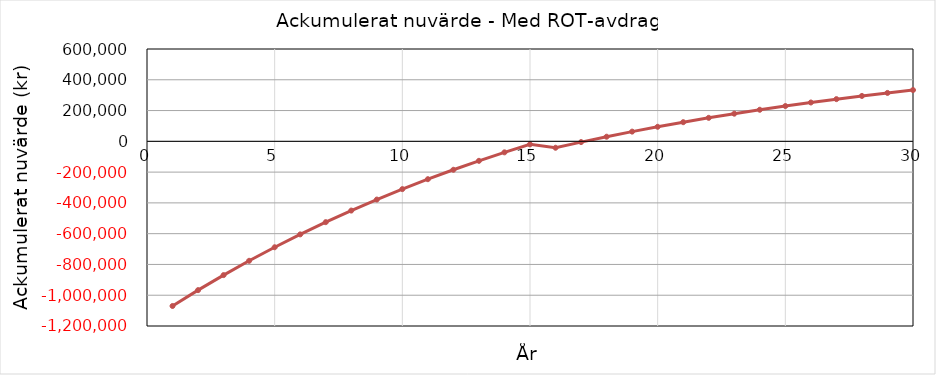
| Category | Ackumulerat |
|---|---|
| 0 | -1070000 |
| 1 | -966993.595 |
| 2 | -869213.772 |
| 3 | -776395.417 |
| 4 | -688286.861 |
| 5 | -604649.194 |
| 6 | -525255.624 |
| 7 | -449890.86 |
| 8 | -378350.527 |
| 9 | -310440.616 |
| 10 | -245976.956 |
| 11 | -184784.717 |
| 12 | -126697.933 |
| 13 | -71559.059 |
| 14 | -19218.537 |
| 15 | -41686.961 |
| 16 | -4914.72 |
| 17 | 29988.31 |
| 18 | 63117.102 |
| 19 | 94561.807 |
| 20 | 124407.996 |
| 21 | 152736.895 |
| 22 | 179625.603 |
| 23 | 205147.305 |
| 24 | 229371.467 |
| 25 | 252364.026 |
| 26 | 274187.571 |
| 27 | 294901.511 |
| 28 | 314562.238 |
| 29 | 333223.277 |
| 30 | 350935.437 |
| 31 | 0 |
| 32 | 0 |
| 33 | 0 |
| 34 | 0 |
| 35 | 0 |
| 36 | 0 |
| 37 | 0 |
| 38 | 0 |
| 39 | 0 |
| 40 | 0 |
| 41 | 0 |
| 42 | 0 |
| 43 | 0 |
| 44 | 0 |
| 45 | 0 |
| 46 | 0 |
| 47 | 0 |
| 48 | 0 |
| 49 | 0 |
| 50 | 0 |